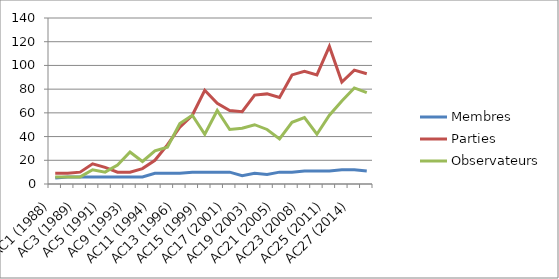
| Category | Membres | Parties | Observateurs |
|---|---|---|---|
| AC1 (1988) | 5 | 9 | 6 |
| AC2 (1989) | 6 | 9 | 6 |
| AC3 (1989) | 6 | 10 | 6 |
| AC4 (1990) | 6 | 17 | 12 |
| AC5 (1991) | 6 | 14 | 10 |
| AC8 (1992) | 6 | 10 | 16 |
| AC9 (1993) | 6 | 10 | 27 |
| AC10 (1994) | 6 | 13 | 19 |
| AC11 (1994) | 9 | 20 | 28 |
| AC12 (1995) | 9 | 33 | 31 |
| AC13 (1996) | 9 | 48 | 51 |
| AC14 (1998) | 10 | 58 | 58 |
| AC15 (1999) | 10 | 79 | 42 |
| AC16 (2000) | 10 | 68 | 62 |
| AC17 (2001) | 10 | 62 | 46 |
| AC18 (2002) | 7 | 61 | 47 |
| AC19 (2003) | 9 | 75 | 50 |
| AC20 (2004) | 8 | 76 | 46 |
| AC21 (2005) | 10 | 73 | 38 |
| AC22 (2006) | 10 | 92 | 52 |
| AC23 (2008) | 11 | 95 | 56 |
| AC24 (2009) | 11 | 92 | 42 |
| AC25 (2011) | 11 | 116 | 58 |
| AC26 (2012) | 12 | 86 | 70 |
| AC27 (2014) | 12 | 96 | 81 |
| AC28 (2015) | 11 | 93 | 77 |